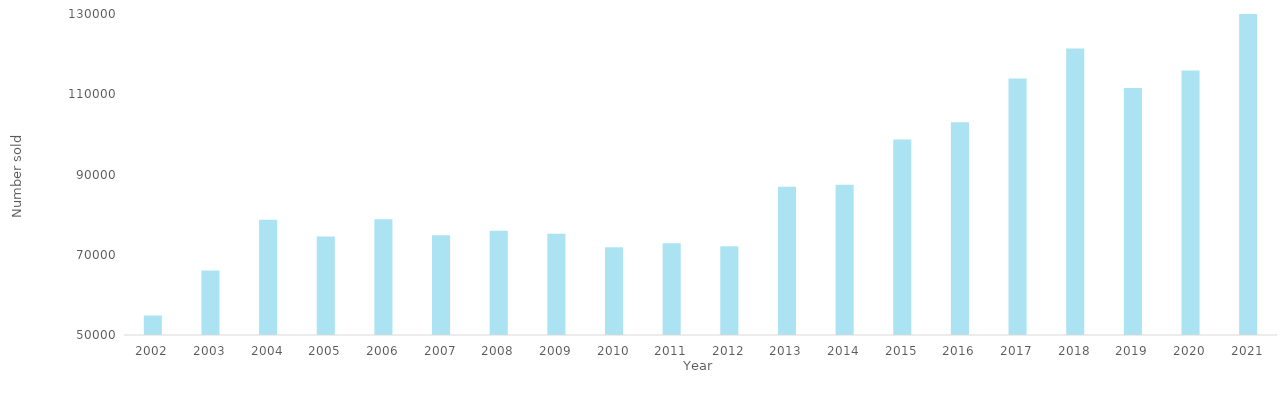
| Category | Series 0 |
|---|---|
| 2002.0 | 54848 |
| 2003.0 | 66077 |
| 2004.0 | 78695 |
| 2005.0 | 74566 |
| 2006.0 | 78868 |
| 2007.0 | 74867 |
| 2008.0 | 75953 |
| 2009.0 | 75235 |
| 2010.0 | 71874 |
| 2011.0 | 72877 |
| 2012.0 | 72113 |
| 2013.0 | 86975 |
| 2014.0 | 87419 |
| 2015.0 | 98696 |
| 2016.0 | 103011 |
| 2017.0 | 113920 |
| 2018.0 | 121405 |
| 2019.0 | 111544 |
| 2020.0 | 115937 |
| 2021.0 | 132962 |